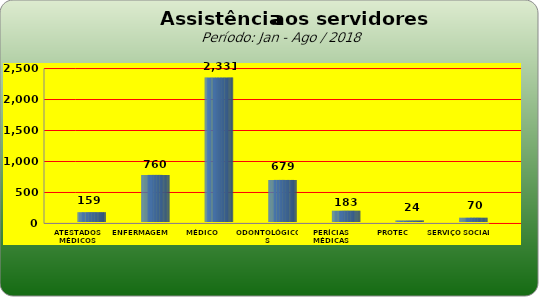
| Category | Series 0 |
|---|---|
| ATESTADOS MÉDICOS | 159 |
| ENFERMAGEM | 760 |
| MÉDICO | 2331 |
| ODONTOLÓGICOS | 679 |
| PERÍCIAS MÉDICAS | 183 |
| PROTEC | 24 |
| SERVIÇO SOCIAL | 70 |